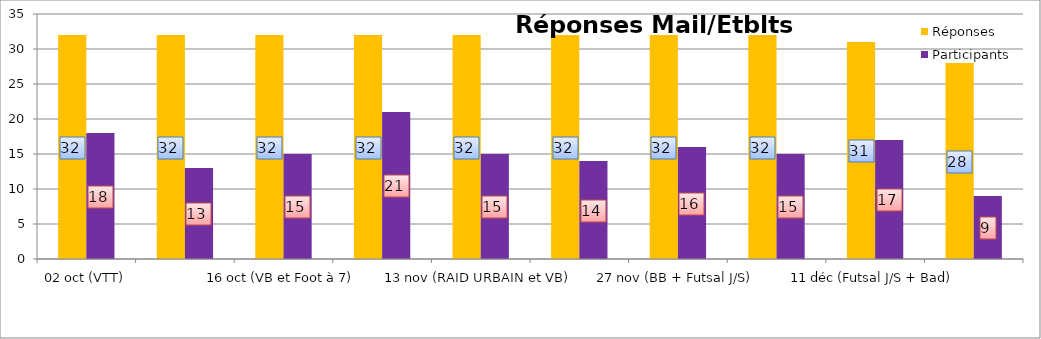
| Category | Réponses | Participants |
|---|---|---|
| 02 oct (VTT) | 32 | 18 |
| 09 oct (Badminton et Rugby) | 32 | 13 |
| 16 oct (VB et Foot à 7) | 32 | 15 |
| 6 nov (BB et Futsal) | 32 | 21 |
| 13 nov (RAID URBAIN et VB) | 32 | 15 |
| 20 nov (Bad + Choré coll + Futsal J/S) | 32 | 14 |
| 27 nov (BB + Futsal J/S) | 32 | 16 |
| 04 déc (BB interdistrict+ Futsal Cadets + Futsal Filles) | 32 | 15 |
| 11 déc (Futsal J/S + Bad) | 31 | 17 |
| 18 déc (BB) | 28 | 9 |